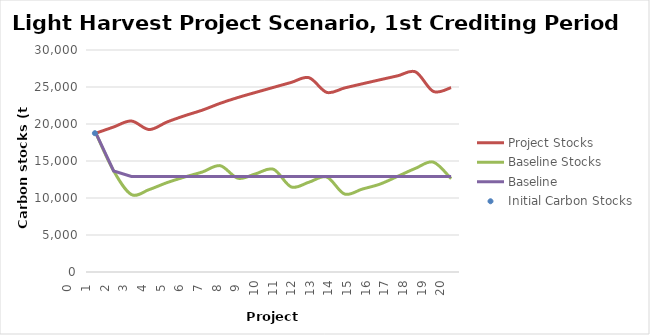
| Category | Project Stocks | Baseline Stocks | Baseline |
|---|---|---|---|
| 0.0 | 18758.947 | 18758.947 | 18758.947 |
| 1.0 | 19596.171 | 13662.69 | 13662.69 |
| 2.0 | 20404.45 | 10470.613 | 12911.622 |
| 3.0 | 19249.557 | 11138.194 | 12911.622 |
| 4.0 | 20264.485 | 12073.979 | 12911.622 |
| 5.0 | 21120.395 | 12837.19 | 12911.622 |
| 6.0 | 21877.378 | 13517.962 | 12911.622 |
| 7.0 | 22797.774 | 14364.712 | 12911.622 |
| 8.0 | 23582.237 | 12668.28 | 12911.622 |
| 9.0 | 24274 | 13271.741 | 12911.622 |
| 10.0 | 24950.008 | 13880.331 | 12911.622 |
| 11.0 | 25619.054 | 11494.334 | 12911.622 |
| 12.0 | 26255.109 | 12137.733 | 12911.622 |
| 13.0 | 24271.468 | 12832.061 | 12911.622 |
| 14.0 | 24872.045 | 10538.397 | 12911.622 |
| 15.0 | 25432.319 | 11206.71 | 12911.622 |
| 16.0 | 25979.768 | 11881.619 | 12911.622 |
| 17.0 | 26516.226 | 12937.218 | 12911.622 |
| 18.0 | 27039.859 | 14012.968 | 12911.622 |
| 19.0 | 24401.461 | 14849.826 | 12911.622 |
| 20.0 | 24914.102 | 12608.557 | 12911.622 |